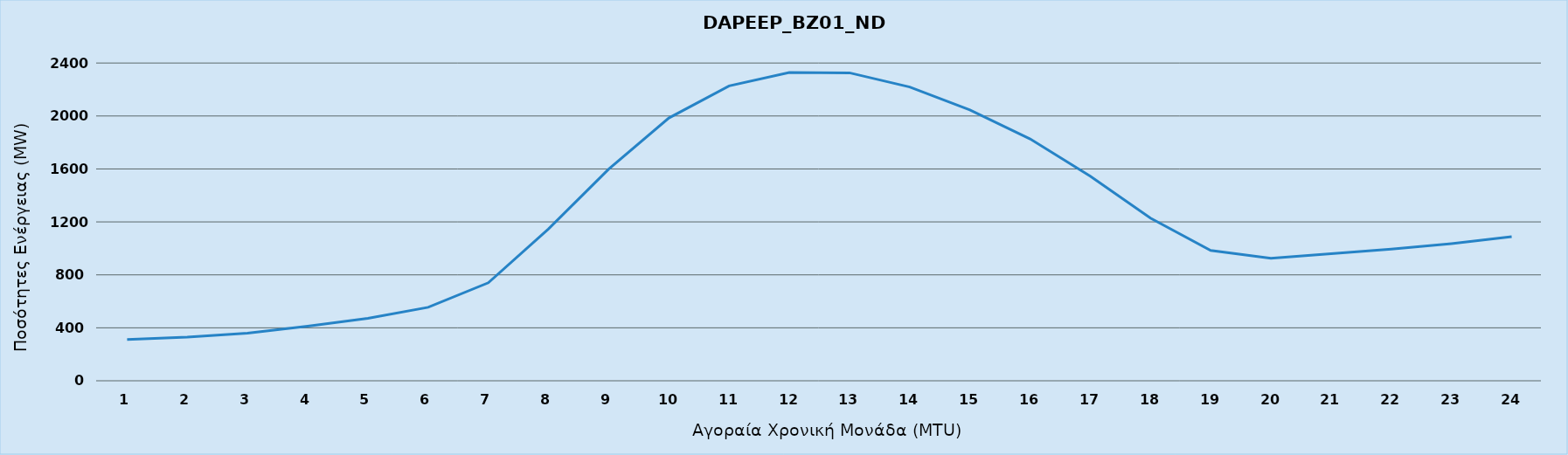
| Category | DAPEEP_BZ01_NDR |
|---|---|
| 0 | 312 |
| 1 | 330 |
| 2 | 360 |
| 3 | 413 |
| 4 | 472 |
| 5 | 555 |
| 6 | 740 |
| 7 | 1147 |
| 8 | 1599 |
| 9 | 1985 |
| 10 | 2227 |
| 11 | 2329 |
| 12 | 2326 |
| 13 | 2219 |
| 14 | 2046 |
| 15 | 1827 |
| 16 | 1545 |
| 17 | 1228 |
| 18 | 984 |
| 19 | 925 |
| 20 | 959 |
| 21 | 994 |
| 22 | 1036 |
| 23 | 1088 |